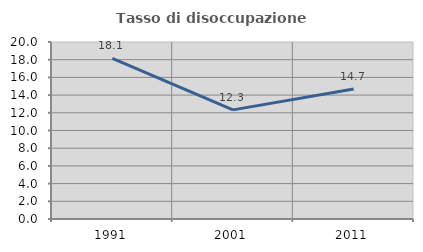
| Category | Tasso di disoccupazione giovanile  |
|---|---|
| 1991.0 | 18.14 |
| 2001.0 | 12.329 |
| 2011.0 | 14.692 |